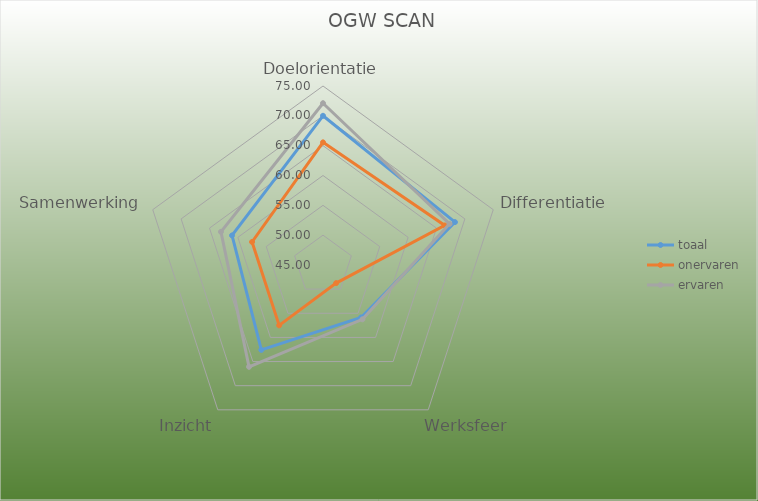
| Category | toaal | onervaren | ervaren |
|---|---|---|---|
| Doelorientatie | 70.007 | 65.556 | 72.115 |
| Differentiatie | 68.254 | 66.458 | 67.308 |
| Werksfeer | 55.867 | 48.75 | 56.25 |
| Inzicht | 62.588 | 57.5 | 66.096 |
| Samenwerking | 61.029 | 57.5 | 62.981 |